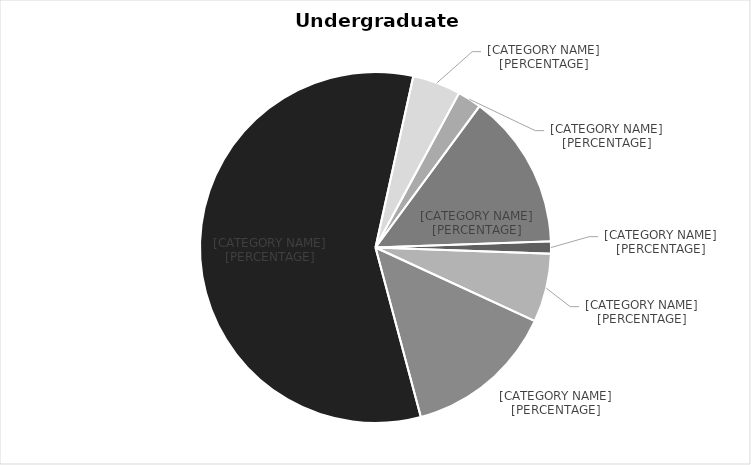
| Category | Series 0 |
|---|---|
| No College Designated | 66 |
| College of Business | 373 |
| College of Computing | 824 |
| College of Engineering | 3401 |
| College of For Res & Env Sci | 262 |
| Interdisciplinary Programs | 130 |
| College of Sciences & Arts | 847 |